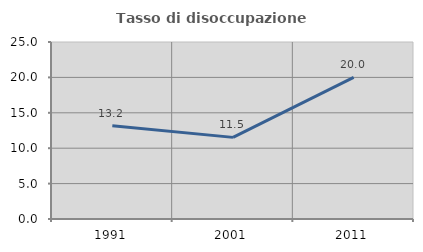
| Category | Tasso di disoccupazione giovanile  |
|---|---|
| 1991.0 | 13.174 |
| 2001.0 | 11.53 |
| 2011.0 | 20 |